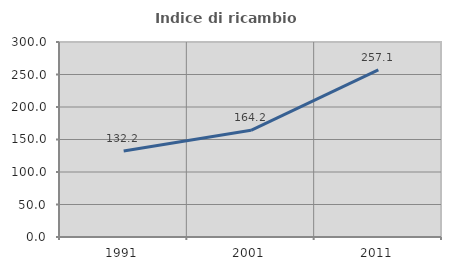
| Category | Indice di ricambio occupazionale  |
|---|---|
| 1991.0 | 132.221 |
| 2001.0 | 164.152 |
| 2011.0 | 257.058 |